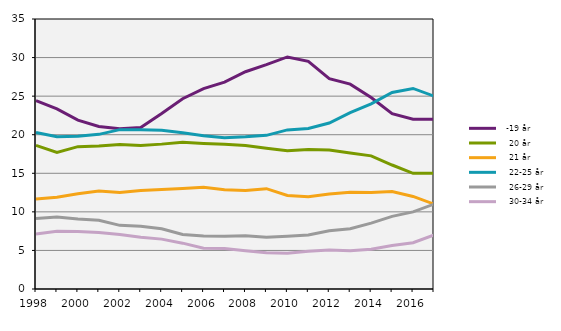
| Category |   -19 år |    20 år |    21 år |    22-25 år |    26-29 år |    30-34 år |
|---|---|---|---|---|---|---|
| 1998 | 24.412 | 18.623 | 11.656 | 20.29 | 9.143 | 7.143 |
| 1999 | 23.34 | 17.707 | 11.885 | 19.728 | 9.346 | 7.494 |
| 2000 | 21.886 | 18.451 | 12.347 | 19.787 | 9.081 | 7.445 |
| 2001 | 21.07 | 18.541 | 12.698 | 20.046 | 8.922 | 7.32 |
| 2002 | 20.784 | 18.736 | 12.517 | 20.655 | 8.253 | 7.051 |
| 2003 | 20.929 | 18.6 | 12.778 | 20.633 | 8.143 | 6.72 |
| 2004 | 22.749 | 18.78 | 12.888 | 20.585 | 7.797 | 6.465 |
| 2005 | 24.67 | 19.026 | 13.034 | 20.245 | 7.075 | 5.942 |
| 2006 | 25.971 | 18.873 | 13.179 | 19.877 | 6.859 | 5.285 |
| 2007 | 26.82 | 18.752 | 12.861 | 19.603 | 6.846 | 5.236 |
| 2008 | 28.161 | 18.604 | 12.774 | 19.722 | 6.908 | 4.969 |
| 2009 | 29.076 | 18.238 | 13.002 | 19.918 | 6.694 | 4.714 |
| 2010 | 30.079 | 17.91 | 12.115 | 20.627 | 6.831 | 4.626 |
| 2011 | 29.507 | 18.079 | 11.947 | 20.803 | 6.991 | 4.886 |
| 2012 | 27.269 | 18.015 | 12.3 | 21.51 | 7.556 | 5.057 |
| 2013 | 26.554 | 17.617 | 12.527 | 22.855 | 7.819 | 4.969 |
| 2014 | 24.828 | 17.258 | 12.514 | 23.994 | 8.545 | 5.164 |
| 2015 | 22.726 | 16.072 | 12.634 | 25.482 | 9.411 | 5.648 |
| 2016 | 22 | 15 | 12 | 26 | 10 | 6 |
| 2017 | 22 | 15 | 11 | 25 | 11 | 7 |